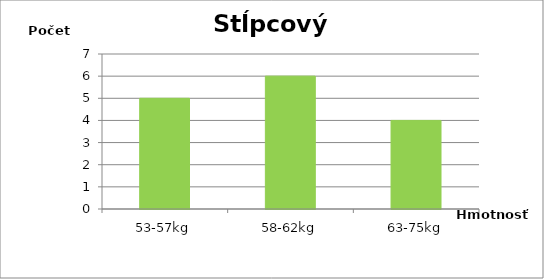
| Category | počet |
|---|---|
| 53-57kg | 5 |
| 58-62kg | 6 |
| 63-75kg | 4 |